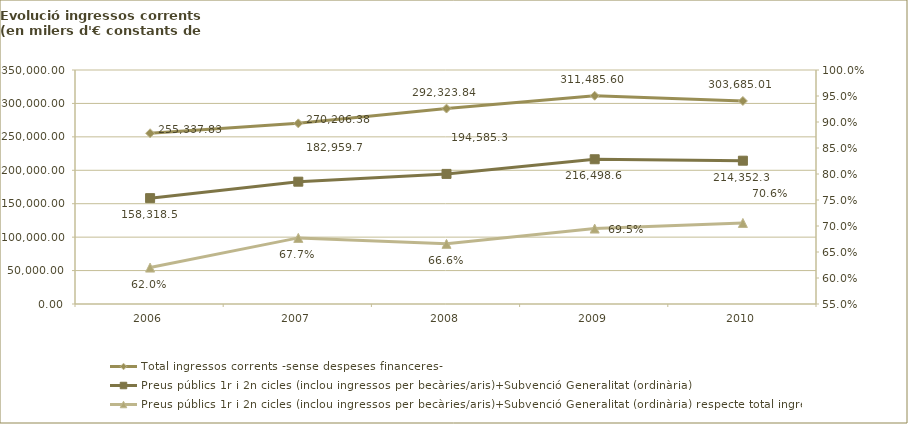
| Category | Total ingressos corrents -sense despeses financeres-  | Preus públics 1r i 2n cicles (inclou ingressos per becàries/aris)+Subvenció Generalitat (ordinària) |
|---|---|---|
| 2006.0 | 255337.831 | 158318.487 |
| 2007.0 | 270206.383 | 182959.677 |
| 2008.0 | 292323.843 | 194585.308 |
| 2009.0 | 311485.599 | 216498.627 |
| 2010.0 | 303685.013 | 214352.251 |